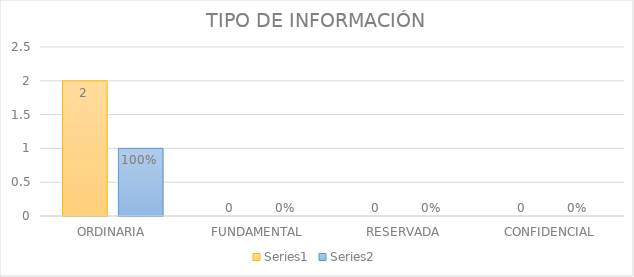
| Category | Series 3 | Series 4 |
|---|---|---|
| ORDINARIA | 2 | 1 |
| FUNDAMENTAL | 0 | 0 |
| RESERVADA | 0 | 0 |
| CONFIDENCIAL | 0 | 0 |